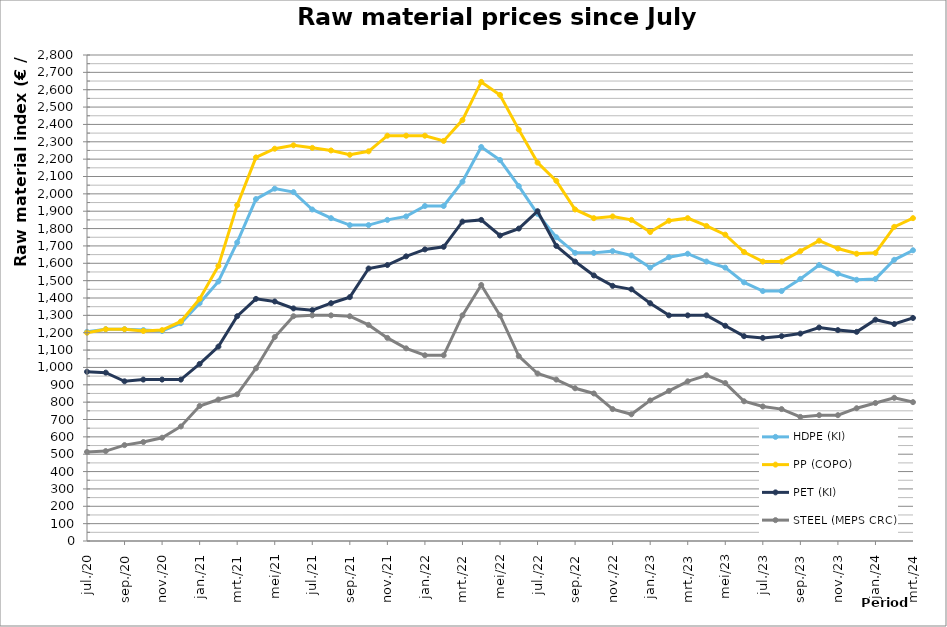
| Category | HDPE (KI) | PP (COPO) | PET (KI) | STEEL (MEPS CRC) |
|---|---|---|---|---|
| 2020-07-01 | 1205 | 1200 | 975 | 513 |
| 2020-08-01 | 1220 | 1220 | 970 | 518 |
| 2020-09-01 | 1220 | 1220 | 920 | 552.5 |
| 2020-10-01 | 1215 | 1210 | 930 | 570 |
| 2020-11-01 | 1210 | 1215 | 930 | 595 |
| 2020-12-01 | 1255 | 1265 | 930 | 660 |
| 2021-01-01 | 1370 | 1395 | 1020 | 778 |
| 2021-02-01 | 1495 | 1585 | 1120 | 815 |
| 2021-03-01 | 1720 | 1935 | 1295 | 845 |
| 2021-04-01 | 1970 | 2210 | 1395 | 995 |
| 2021-05-01 | 2030 | 2260 | 1380 | 1175 |
| 2021-06-01 | 2010 | 2280 | 1340 | 1295 |
| 2021-07-01 | 1910 | 2265 | 1330 | 1300 |
| 2021-08-01 | 1860 | 2250 | 1370 | 1300 |
| 2021-09-01 | 1820 | 2225 | 1405 | 1295 |
| 2021-10-01 | 1820 | 2245 | 1570 | 1245 |
| 2021-11-01 | 1850 | 2335 | 1590 | 1170 |
| 2021-12-01 | 1870 | 2335 | 1640 | 1110 |
| 2022-01-01 | 1930 | 2335 | 1680 | 1070 |
| 2022-02-01 | 1930 | 2305 | 1695 | 1070 |
| 2022-03-01 | 2070 | 2425 | 1840 | 1300 |
| 2022-04-01 | 2270 | 2645 | 1850 | 1475 |
| 2022-05-01 | 2195 | 2570 | 1760 | 1300 |
| 2022-06-01 | 2045 | 2370 | 1800 | 1065 |
| 2022-07-01 | 1885 | 2180 | 1900 | 965 |
| 2022-08-01 | 1750 | 2075 | 1700 | 930 |
| 2022-09-01 | 1660 | 1910 | 1610 | 880 |
| 2022-10-01 | 1660 | 1860 | 1530 | 850 |
| 2022-11-01 | 1670 | 1870 | 1470 | 760 |
| 2022-12-01 | 1645 | 1850 | 1450 | 730 |
| 2023-01-01 | 1575 | 1780 | 1370 | 810 |
| 2023-02-01 | 1635 | 1845 | 1300 | 865 |
| 2023-03-01 | 1655 | 1860 | 1300 | 920 |
| 2023-04-01 | 1610 | 1815 | 1300 | 955 |
| 2023-05-01 | 1575 | 1765 | 1240 | 910 |
| 2023-06-01 | 1490 | 1665 | 1180 | 805 |
| 2023-07-01 | 1440 | 1610 | 1170 | 775 |
| 2023-08-01 | 1440 | 1610 | 1180 | 760 |
| 2023-09-01 | 1510 | 1670 | 1195 | 715 |
| 2023-10-01 | 1590 | 1730 | 1230 | 725 |
| 2023-11-01 | 1540 | 1685 | 1215 | 725 |
| 2023-12-01 | 1505 | 1655 | 1205 | 765 |
| 2024-01-01 | 1510 | 1660 | 1275 | 795 |
| 2024-02-01 | 1620 | 1810 | 1250 | 825 |
| 2024-03-01 | 1675 | 1860 | 1285 | 800 |